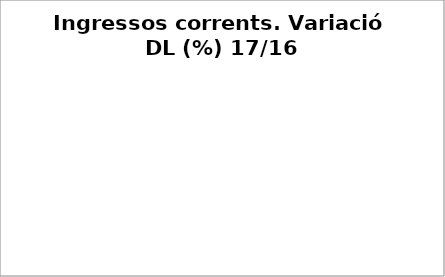
| Category | Series 0 |
|---|---|
| Impostos locals | 0.087 |
| Participació Tributs de l'Estat | 0 |
| Taxes i altres ingressos | -0.4 |
| Transferències corrents (exc. FCF) | -0.655 |
| Ingressos patrimonials | 0.564 |
| Ingressos corrents | 0.01 |